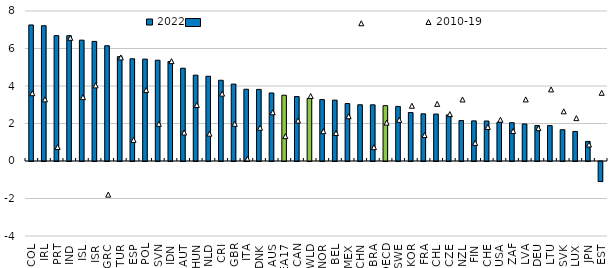
| Category | 2022 |
|---|---|
| COL | 7.257 |
| IRL | 7.214 |
| PRT | 6.687 |
| IND | 6.681 |
| ISL | 6.445 |
| ISR | 6.379 |
| GRC | 6.146 |
| TUR | 5.566 |
| ESP | 5.452 |
| POL | 5.433 |
| SVN | 5.375 |
| IDN | 5.309 |
| AUT | 4.948 |
| HUN | 4.578 |
| NLD | 4.519 |
| CRI | 4.305 |
| GBR | 4.102 |
| ITA | 3.826 |
| DNK | 3.819 |
| AUS | 3.629 |
| EA17 | 3.507 |
| CAN | 3.438 |
| WLD | 3.34 |
| NOR | 3.277 |
| BEL | 3.247 |
| MEX | 3.062 |
| CHN | 3 |
| BRA | 2.996 |
| OECD | 2.952 |
| SWE | 2.911 |
| KOR | 2.584 |
| FRA | 2.516 |
| CHL | 2.504 |
| CZE | 2.46 |
| NZL | 2.157 |
| FIN | 2.139 |
| CHE | 2.134 |
| USA | 2.062 |
| ZAF | 2.042 |
| LVA | 1.976 |
| DEU | 1.889 |
| LTU | 1.888 |
| SVK | 1.669 |
| LUX | 1.576 |
| JPN | 1.046 |
| EST | -1.069 |